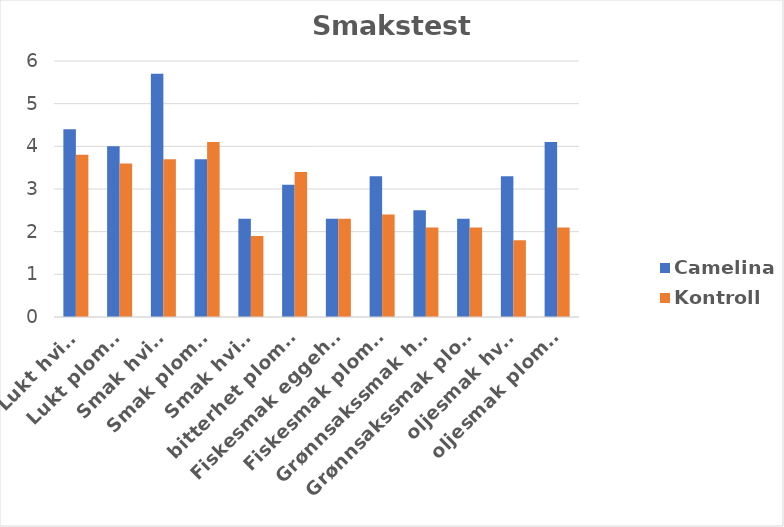
| Category | Camelina | Kontroll |
|---|---|---|
| Lukt hvite | 4.4 | 3.8 |
| Lukt plomme | 4 | 3.6 |
| Smak hvite | 5.7 | 3.7 |
| Smak plomme | 3.7 | 4.1 |
| Smak hvite | 2.3 | 1.9 |
| bitterhet plomme | 3.1 | 3.4 |
| Fiskesmak eggehvite | 2.3 | 2.3 |
| Fiskesmak plomme | 3.3 | 2.4 |
| Grønnsakssmak hvite | 2.5 | 2.1 |
| Grønnsakssmak plomme | 2.3 | 2.1 |
| oljesmak hvite | 3.3 | 1.8 |
| oljesmak plomme | 4.1 | 2.1 |